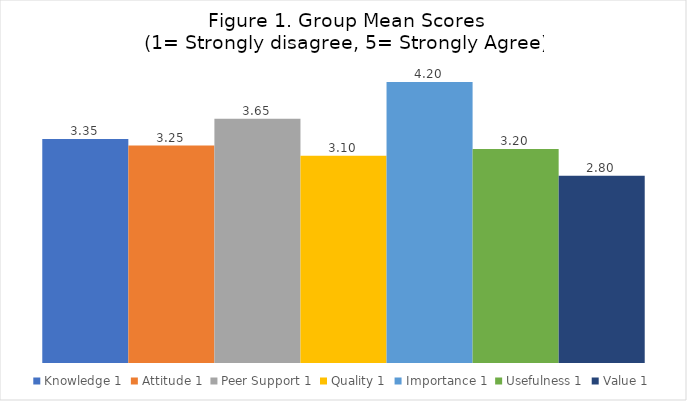
| Category | Knowledge 1 | Attitude 1 | Peer Support 1 | Quality 1 | Importance 1 | Usefulness 1 | Value 1 |
|---|---|---|---|---|---|---|---|
| 3.35 | 3.35 | 3.25 | 3.65 | 3.1 | 4.2 | 3.2 | 2.8 |